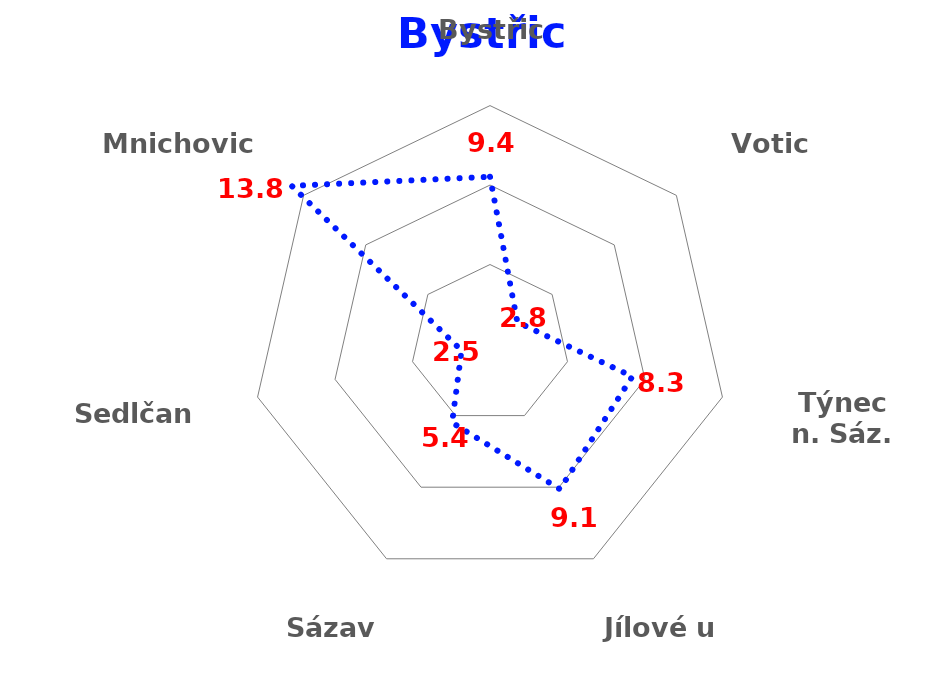
| Category | Series 0 |
|---|---|
| Bystřice | 9.416 |
| Votice | 2.763 |
| Týnec n. Sáz. | 8.349 |
| Jílové u P. | 9.11 |
| Sázava | 5.394 |
| Sedlčany | 2.469 |
| Mnichovice | 13.767 |